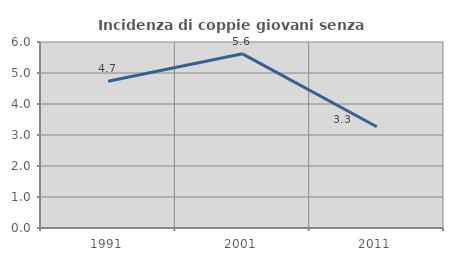
| Category | Incidenza di coppie giovani senza figli |
|---|---|
| 1991.0 | 4.737 |
| 2001.0 | 5.618 |
| 2011.0 | 3.267 |